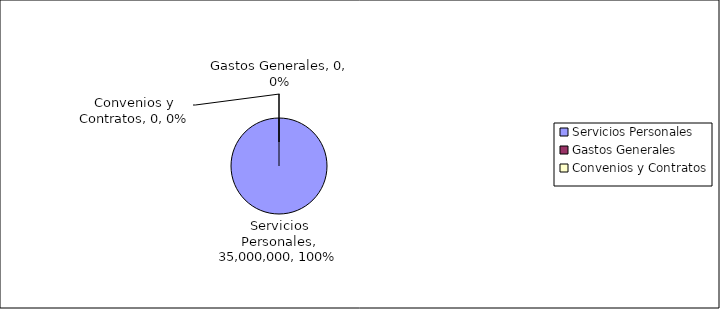
| Category | Series 0 |
|---|---|
| Servicios Personales | 35000000 |
| Gastos Generales | 0 |
| Convenios y Contratos | 0 |